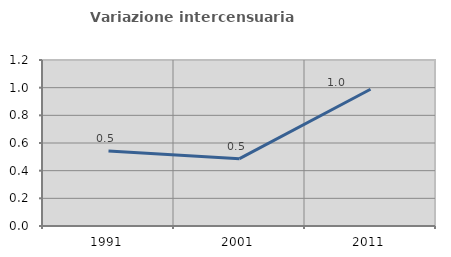
| Category | Variazione intercensuaria annua |
|---|---|
| 1991.0 | 0.542 |
| 2001.0 | 0.487 |
| 2011.0 | 0.988 |